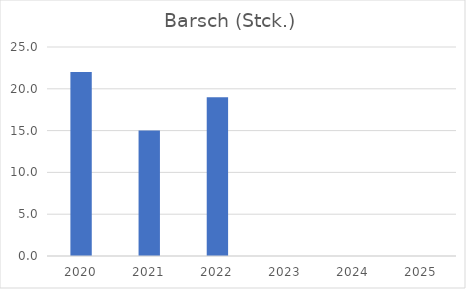
| Category | Barsch (Stck.) |
|---|---|
| 2020.0 | 22 |
| 2021.0 | 15 |
| 2022.0 | 19 |
| 2023.0 | 0 |
| 2024.0 | 0 |
| 2025.0 | 0 |